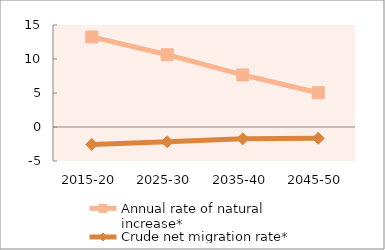
| Category | Annual rate of natural increase* | Crude net migration rate* |
|---|---|---|
| 2015-20 | 13.246 | -2.568 |
| 2025-30 | 10.632 | -2.176 |
| 2035-40 | 7.655 | -1.737 |
| 2045-50 | 5.036 | -1.659 |